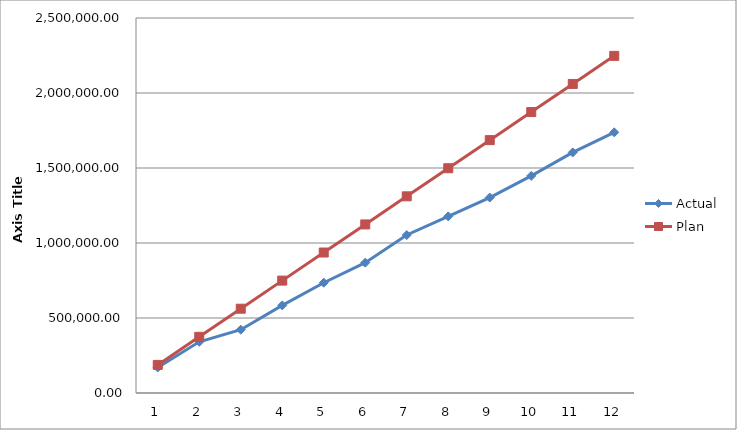
| Category | Actual | Plan |
|---|---|---|
| 0 | 170274.33 | 187304 |
| 1 | 341536.09 | 374608 |
| 2 | 421884.3 | 561912 |
| 3 | 584106.87 | 749216 |
| 4 | 735205.7 | 936520 |
| 5 | 868844.74 | 1123824 |
| 6 | 1053302.21 | 1311128 |
| 7 | 1177433.64 | 1498432 |
| 8 | 1303048.08 | 1685736 |
| 9 | 1447309.78 | 1873040 |
| 10 | 1603859.28 | 2060344 |
| 11 | 1737926.27 | 2247648 |